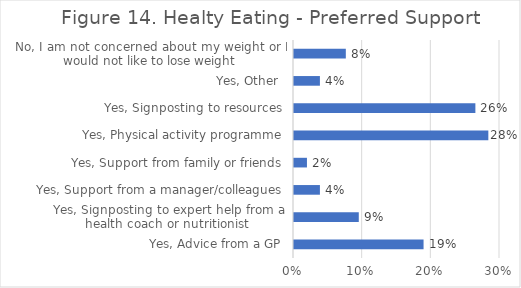
| Category | Series 0 |
|---|---|
| Yes, Advice from a GP | 0.189 |
| Yes, Signposting to expert help from a health coach or nutritionist  | 0.094 |
| Yes, Support from a manager/colleagues | 0.038 |
| Yes, Support from family or friends | 0.019 |
| Yes, Physical activity programme | 0.283 |
| Yes, Signposting to resources | 0.264 |
| Yes, Other  | 0.038 |
| No, I am not concerned about my weight or I would not like to lose weight | 0.075 |